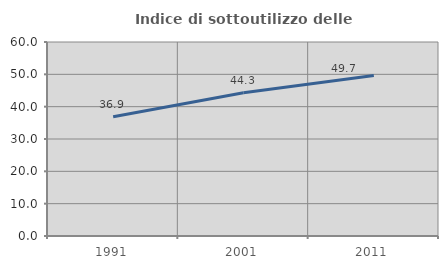
| Category | Indice di sottoutilizzo delle abitazioni  |
|---|---|
| 1991.0 | 36.891 |
| 2001.0 | 44.327 |
| 2011.0 | 49.667 |